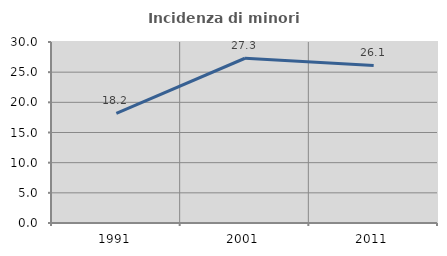
| Category | Incidenza di minori stranieri |
|---|---|
| 1991.0 | 18.182 |
| 2001.0 | 27.306 |
| 2011.0 | 26.119 |